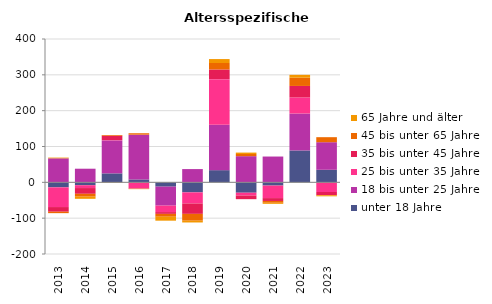
| Category | unter 18 Jahre | 18 bis unter 25 Jahre | 25 bis unter 35 Jahre | 35 bis unter 45 Jahre | 45 bis unter 65 Jahre | 65 Jahre und älter |
|---|---|---|---|---|---|---|
| 2013.0 | -14 | 67 | -55 | -13 | -4 | 2 |
| 2014.0 | -8 | 38 | -8 | -16 | -8 | -6 |
| 2015.0 | 25 | 92 | 1 | 12 | 2 | -1 |
| 2016.0 | 8 | 125 | -17 | -1 | 4 | -1 |
| 2017.0 | -12 | -53 | -18 | -5 | -8 | -11 |
| 2018.0 | -28 | 37 | -31 | -29 | -19 | -5 |
| 2019.0 | 34 | 127 | 127 | 27 | 18 | 11 |
| 2020.0 | -29 | 73 | -8 | -10 | 6 | 4 |
| 2021.0 | -9 | 72 | -35 | -8 | -5 | -3 |
| 2022.0 | 89 | 103 | 45 | 32 | 23 | 8 |
| 2023.0 | 35 | 77 | -27 | -9 | 14 | -3 |